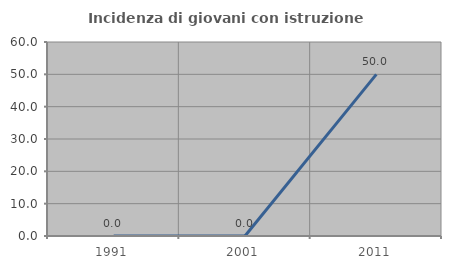
| Category | Incidenza di giovani con istruzione universitaria |
|---|---|
| 1991.0 | 0 |
| 2001.0 | 0 |
| 2011.0 | 50 |